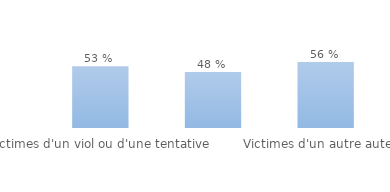
| Category | au moins une démarche |
|---|---|
| Victimes d'un viol ou d'une tentative | 0.528 |
| Victimes par un conjoint ou un ex | 0.479 |
| Victimes d'un autre auteur | 0.564 |